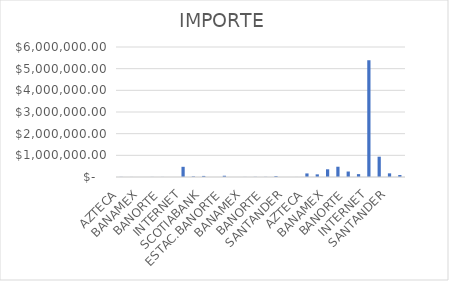
| Category | IMPORTE |
|---|---|
| AZTECA | 5871.74 |
| BAJIO | 2446.52 |
| BANAMEX | 602.75 |
| BANCOMER | 3760.64 |
| BANORTE | 3104.9 |
| HSBC | 762.43 |
| INTERNET | 470259.87 |
| SANTANDER | 27186.64 |
| SCOTIABANK | 49622.34 |
| OXXO | 236 |
| ESTAC.BANORTE | 57995 |
| BAJIO | 1002 |
| BANAMEX | 3318.88 |
| BANCOMER | 7202.5 |
| BANORTE | 6804 |
| INTERNET | 43512.3 |
| SANTANDER | 300 |
| SCOTIABANK | 1500 |
| AZTECA | 164916.52 |
| BAJIO | 121823.55 |
| BANAMEX | 356191.12 |
| BANCOMER | 474155.37 |
| BANORTE | 253129.58 |
| HSBC | 132534.06 |
| INTERNET | 5388901.98 |
| OXXO | 936924.65 |
| SANTANDER | 168577.58 |
| SCOTIABANK | 91005.08 |